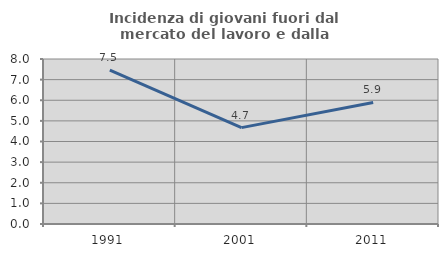
| Category | Incidenza di giovani fuori dal mercato del lavoro e dalla formazione  |
|---|---|
| 1991.0 | 7.458 |
| 2001.0 | 4.673 |
| 2011.0 | 5.895 |